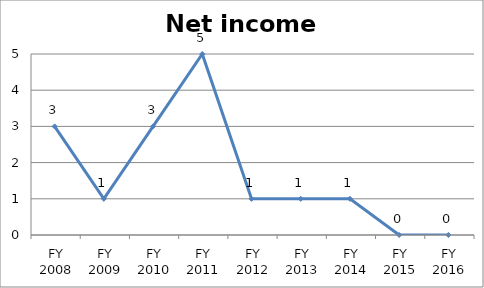
| Category | Net income score |
|---|---|
| FY 2016 | 0 |
| FY 2015 | 0 |
| FY 2014 | 1 |
| FY 2013 | 1 |
| FY 2012 | 1 |
| FY 2011 | 5 |
| FY 2010 | 3 |
| FY 2009 | 1 |
| FY 2008 | 3 |